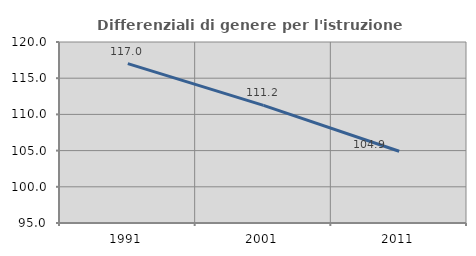
| Category | Differenziali di genere per l'istruzione superiore |
|---|---|
| 1991.0 | 117.012 |
| 2001.0 | 111.24 |
| 2011.0 | 104.91 |